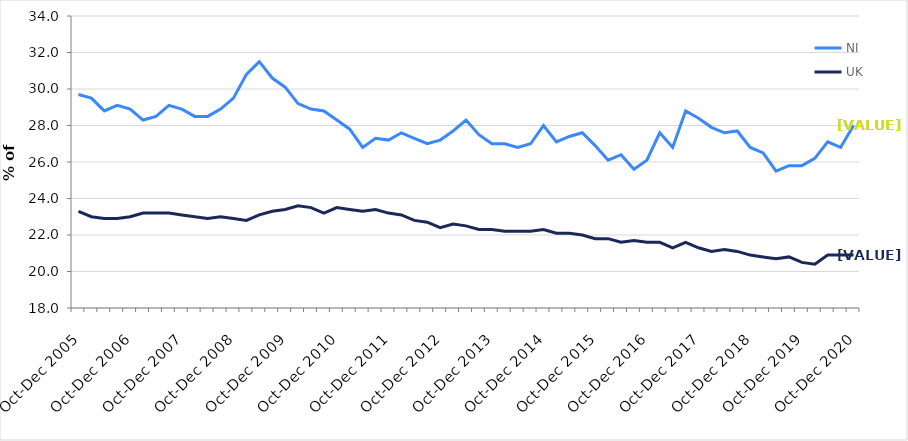
| Category | NI | UK |
|---|---|---|
| Oct-Dec 2005 | 29.7 | 23.3 |
| Jan-Mar 2006 | 29.5 | 23 |
| Apr-Jun 2006 | 28.8 | 22.9 |
| Jul-Sep 2006 | 29.1 | 22.9 |
| Oct-Dec 2006 | 28.9 | 23 |
| Jan-Mar 2007 | 28.3 | 23.2 |
| Apr-Jun 2007 | 28.5 | 23.2 |
| Jul-Sep 2007 | 29.1 | 23.2 |
| Oct-Dec 2007 | 28.9 | 23.1 |
| Jan-Mar 2008 | 28.5 | 23 |
| Apr-Jun 2008 | 28.5 | 22.9 |
| Jul-Sep 2008 | 28.9 | 23 |
| Oct-Dec 2008 | 29.5 | 22.9 |
| Jan-Mar 2009 | 30.8 | 22.8 |
| Apr-Jun 2009 | 31.5 | 23.1 |
| Jul-Sep 2009 | 30.6 | 23.3 |
| Oct-Dec 2009 | 30.1 | 23.4 |
| Jan-Mar 2010 | 29.2 | 23.6 |
| Apr-Jun 2010 | 28.9 | 23.5 |
| Jul-Sep 2010 | 28.8 | 23.2 |
| Oct-Dec 2010 | 28.3 | 23.5 |
| Jan-Mar 2011 | 27.8 | 23.4 |
| Apr-Jun 2011 | 26.8 | 23.3 |
| Jul-Sep 2011 | 27.3 | 23.4 |
| Oct-Dec 2011 | 27.2 | 23.2 |
| Jan-Mar 2012 | 27.6 | 23.1 |
| Apr-Jun 2012 | 27.3 | 22.8 |
| Jul-Sep 2012 | 27 | 22.7 |
| Oct-Dec 2012 | 27.2 | 22.4 |
| Jan-Mar 2013 | 27.7 | 22.6 |
| Apr-Jun 2013 | 28.3 | 22.5 |
| Jul-Sep 2013 | 27.5 | 22.3 |
| Oct-Dec 2013 | 27 | 22.3 |
| Jan-Mar 2014 | 27 | 22.2 |
| Apr-Jun 2014 | 26.8 | 22.2 |
| Jul-Sep 2014 | 27 | 22.2 |
| Oct-Dec 2014 | 28 | 22.3 |
| Jan-Mar 2015 | 27.1 | 22.1 |
| Apr-Jun 2015 | 27.4 | 22.1 |
| Jul-Sep 2015 | 27.6 | 22 |
| Oct-Dec 2015 | 26.9 | 21.8 |
| Jan-Mar 2016 | 26.1 | 21.8 |
| Apr-Jun 2016 | 26.4 | 21.6 |
| Jul-Sep 2016 | 25.6 | 21.7 |
| Oct-Dec 2016 | 26.1 | 21.6 |
| Jan-Mar 2017 | 27.6 | 21.6 |
| Apr-Jun 2017 | 26.8 | 21.3 |
| Jul-Sep 2017 | 28.8 | 21.6 |
| Oct-Dec 2017 | 28.4 | 21.3 |
| Jan-Mar 2018 | 27.9 | 21.1 |
| Apr-Jun 2018 | 27.6 | 21.2 |
| Jul-Sep 2018 | 27.7 | 21.1 |
| Oct-Dec 2018 | 26.8 | 20.9 |
| Jan-Mar 2019 | 26.5 | 20.8 |
| Apr-Jun 2019 | 25.5 | 20.7 |
| Jul-Sep 2019 | 25.8 | 20.8 |
| Oct-Dec 2019 | 25.8 | 20.5 |
| Jan-Mar 2020 | 26.2 | 20.4 |
| Apr-Jun 2020 | 27.1 | 20.9 |
| Jul-Sep 2020 | 26.8 | 20.9 |
| Oct-Dec 2020 | 28 | 20.9 |